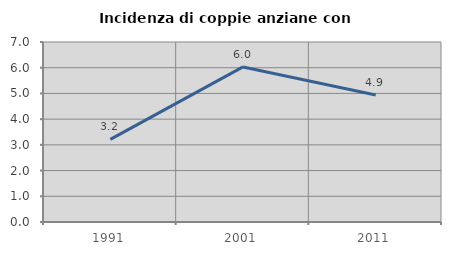
| Category | Incidenza di coppie anziane con figli |
|---|---|
| 1991.0 | 3.212 |
| 2001.0 | 6.031 |
| 2011.0 | 4.942 |